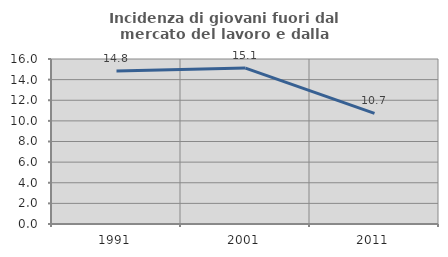
| Category | Incidenza di giovani fuori dal mercato del lavoro e dalla formazione  |
|---|---|
| 1991.0 | 14.833 |
| 2001.0 | 15.122 |
| 2011.0 | 10.734 |